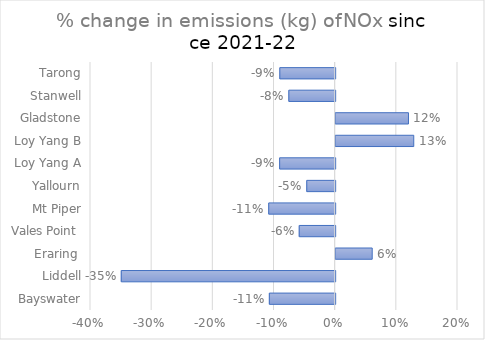
| Category | Series 0 |
|---|---|
| Bayswater | -0.108 |
| Liddell | -0.35 |
|  Eraring  | 0.06 |
| Vales Point  | -0.059 |
| Mt Piper | -0.109 |
| Yallourn | -0.046 |
| Loy Yang A | -0.091 |
| Loy Yang B | 0.128 |
| Gladstone | 0.119 |
| Stanwell | -0.076 |
| Tarong | -0.09 |